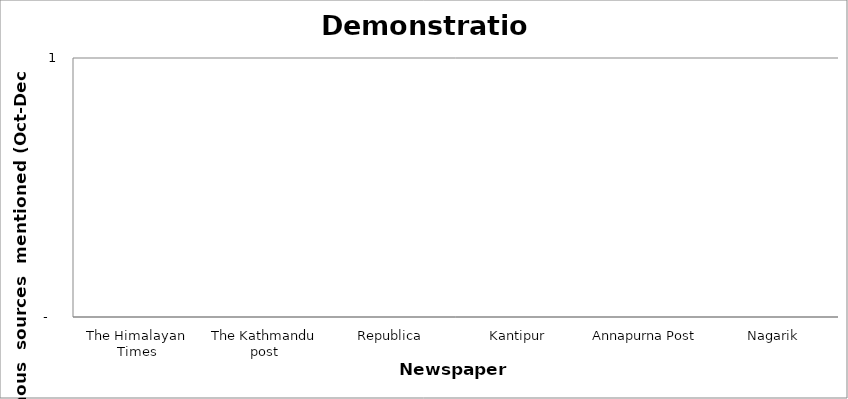
| Category | Demonstration |
|---|---|
| The Himalayan Times | 0 |
| The Kathmandu post | 0 |
| Republica | 0 |
| Kantipur | 0 |
| Annapurna Post | 0 |
| Nagarik | 0 |